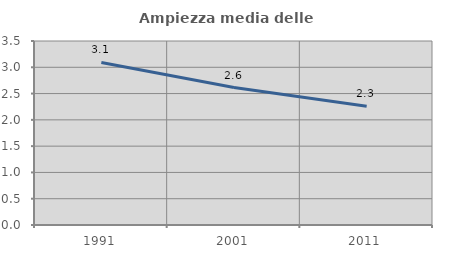
| Category | Ampiezza media delle famiglie |
|---|---|
| 1991.0 | 3.092 |
| 2001.0 | 2.615 |
| 2011.0 | 2.261 |